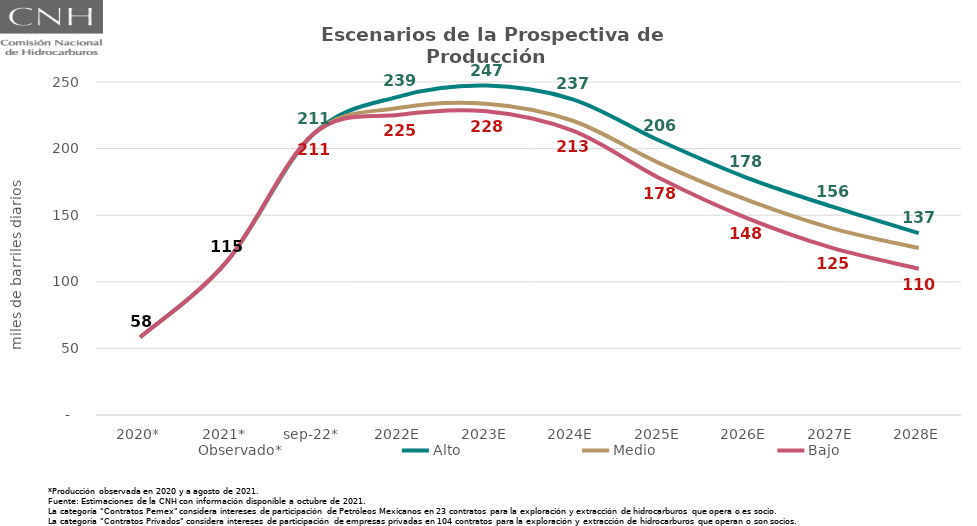
| Category | Observado* | Alto | Medio | Bajo |
|---|---|---|---|---|
| 2020* | 58.421 | 58.421 | 58.421 | 58.421 |
| 2021* | 115.166 | 115.166 | 115.166 | 115.166 |
| sep-22* | 210.883 | 210.883 | 210.883 | 210.883 |
| 2022E | 230.623 | 239.262 | 230.623 | 225.356 |
| 2023E | 233.737 | 247.348 | 233.737 | 227.997 |
| 2024E | 220.901 | 237.025 | 220.901 | 213.428 |
| 2025E | 189.089 | 206.055 | 189.089 | 177.962 |
| 2026E | 161.79 | 178.45 | 161.79 | 148.19 |
| 2027E | 140.11 | 156.399 | 140.11 | 125.412 |
| 2028E | 125.321 | 136.607 | 125.321 | 109.839 |